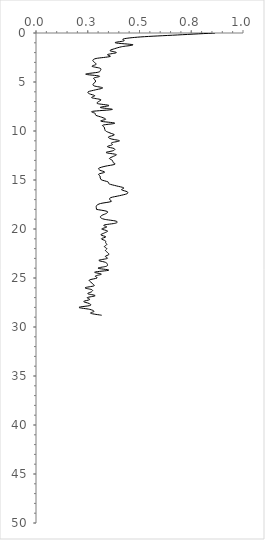
| Category | Series 0 |
|---|---|
| 0.8651 | 0 |
| 0.683 | 0.2 |
| 0.5065 | 0.4 |
| 0.4229 | 0.6 |
| 0.4256 | 0.8 |
| 0.3828 | 1 |
| 0.468 | 1.2 |
| 0.4139 | 1.4 |
| 0.3801 | 1.6 |
| 0.3577 | 1.8 |
| 0.3883 | 2 |
| 0.3458 | 2.2 |
| 0.3575 | 2.4 |
| 0.2903 | 2.6 |
| 0.2744 | 2.8 |
| 0.2826 | 3 |
| 0.2906 | 3.2 |
| 0.2707 | 3.4 |
| 0.3097 | 3.6 |
| 0.3115 | 3.8 |
| 0.3003 | 4 |
| 0.24 | 4.2 |
| 0.3063 | 4.4 |
| 0.2789 | 4.6 |
| 0.2856 | 4.8 |
| 0.2871 | 5 |
| 0.276 | 5.2 |
| 0.2813 | 5.4 |
| 0.3222 | 5.6 |
| 0.2874 | 5.8 |
| 0.2519 | 6 |
| 0.2578 | 6.2 |
| 0.2837 | 6.4 |
| 0.2691 | 6.6 |
| 0.3131 | 6.8 |
| 0.3019 | 7 |
| 0.2969 | 7.2 |
| 0.3526 | 7.4 |
| 0.3102 | 7.6 |
| 0.3688 | 7.8 |
| 0.2725 | 8 |
| 0.2858 | 8.2 |
| 0.2895 | 8.4 |
| 0.3178 | 8.6 |
| 0.3366 | 8.8 |
| 0.3133 | 9 |
| 0.3808 | 9.2 |
| 0.324 | 9.4 |
| 0.3294 | 9.6 |
| 0.332 | 9.8 |
| 0.3366 | 10 |
| 0.3575 | 10.2 |
| 0.3786 | 10.4 |
| 0.3506 | 10.6 |
| 0.362 | 10.8 |
| 0.4034 | 11 |
| 0.3653 | 11.2 |
| 0.3688 | 11.4 |
| 0.3448 | 11.6 |
| 0.3783 | 11.8 |
| 0.3741 | 12 |
| 0.3386 | 12.2 |
| 0.3875 | 12.4 |
| 0.3726 | 12.6 |
| 0.3547 | 12.8 |
| 0.369 | 13 |
| 0.3721 | 13.2 |
| 0.3806 | 13.4 |
| 0.3335 | 13.6 |
| 0.3034 | 13.8 |
| 0.3089 | 14 |
| 0.3317 | 14.2 |
| 0.3029 | 14.4 |
| 0.3097 | 14.6 |
| 0.31 | 14.8 |
| 0.3162 | 15 |
| 0.3481 | 15.2 |
| 0.3539 | 15.4 |
| 0.3883 | 15.6 |
| 0.4239 | 15.8 |
| 0.4132 | 16 |
| 0.4406 | 16.2 |
| 0.4394 | 16.4 |
| 0.4034 | 16.6 |
| 0.361 | 16.8 |
| 0.3562 | 17 |
| 0.3625 | 17.2 |
| 0.3118 | 17.4 |
| 0.2929 | 17.6 |
| 0.2911 | 17.8 |
| 0.2924 | 18 |
| 0.343 | 18.2 |
| 0.3404 | 18.4 |
| 0.3191 | 18.6 |
| 0.311 | 18.8 |
| 0.3289 | 19 |
| 0.3865 | 19.2 |
| 0.385 | 19.4 |
| 0.3283 | 19.6 |
| 0.3417 | 19.8 |
| 0.3175 | 20 |
| 0.3455 | 20.2 |
| 0.3304 | 20.4 |
| 0.3133 | 20.6 |
| 0.3371 | 20.8 |
| 0.3159 | 21 |
| 0.335 | 21.2 |
| 0.3366 | 21.4 |
| 0.3419 | 21.6 |
| 0.3302 | 21.8 |
| 0.3422 | 22 |
| 0.3355 | 22.2 |
| 0.3458 | 22.4 |
| 0.3521 | 22.6 |
| 0.3348 | 22.8 |
| 0.3448 | 23 |
| 0.3037 | 23.2 |
| 0.3353 | 23.4 |
| 0.345 | 23.6 |
| 0.3402 | 23.8 |
| 0.2995 | 24 |
| 0.3516 | 24.2 |
| 0.2837 | 24.4 |
| 0.3159 | 24.6 |
| 0.2866 | 24.8 |
| 0.2948 | 25 |
| 0.2581 | 25.2 |
| 0.2643 | 25.4 |
| 0.2733 | 25.6 |
| 0.28 | 25.8 |
| 0.237 | 26 |
| 0.2709 | 26.2 |
| 0.2688 | 26.4 |
| 0.25 | 26.6 |
| 0.2858 | 26.8 |
| 0.2476 | 27 |
| 0.2594 | 27.2 |
| 0.2304 | 27.4 |
| 0.2562 | 27.6 |
| 0.2621 | 27.8 |
| 0.2076 | 28 |
| 0.2597 | 28.2 |
| 0.2803 | 28.4 |
| 0.264 | 28.6 |
| 0.3172 | 28.8 |